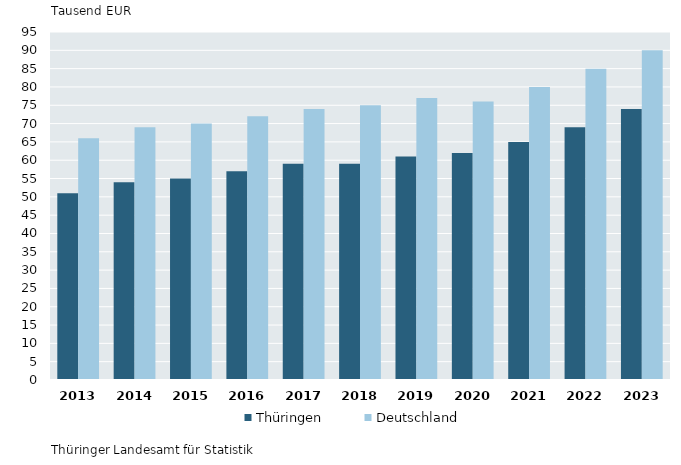
| Category | Thüringen | Deutschland |
|---|---|---|
| 2013.0 | 51 | 66 |
| 2014.0 | 54 | 69 |
| 2015.0 | 55 | 70 |
| 2016.0 | 57 | 72 |
| 2017.0 | 59 | 74 |
| 2018.0 | 59 | 75 |
| 2019.0 | 61 | 77 |
| 2020.0 | 62 | 76 |
| 2021.0 | 65 | 80 |
| 2022.0 | 69 | 85 |
| 2023.0 | 74 | 90 |